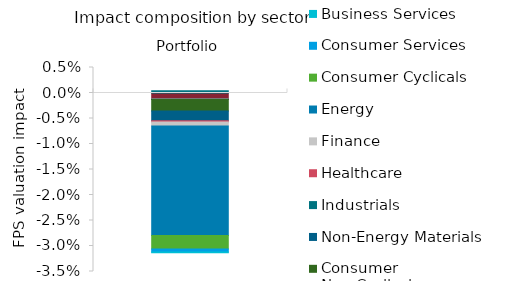
| Category | Utilities | Telecommunications | Technology | Consumer Non-Cyclicals | Non-Energy Materials | Industrials | Healthcare | Finance | Energy | Consumer Cyclicals | Consumer Services | Business Services |
|---|---|---|---|---|---|---|---|---|---|---|---|---|
| Portfolio | -0.001 | 0 | 0 | -0.002 | -0.002 | 0 | 0 | -0.001 | -0.021 | -0.003 | -0.001 | 0 |